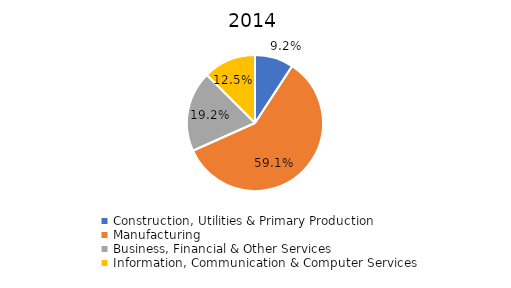
| Category | Series 0 |
|---|---|
| Construction, Utilities & Primary Production  | 0.092 |
| Manufacturing  | 0.591 |
| Business, Financial & Other Services | 0.192 |
| Information, Communication & Computer Services | 0.125 |